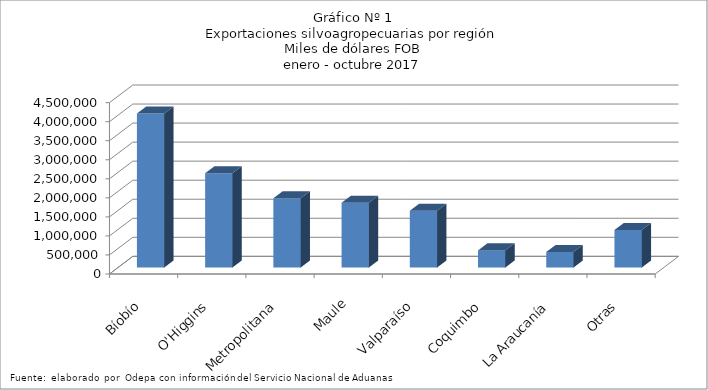
| Category | Series 0 |
|---|---|
| Bíobío | 4043255.953 |
| O'Higgins | 2475510.904 |
| Metropolitana | 1818499.797 |
| Maule | 1699561.113 |
| Valparaíso | 1492713.511 |
| Coquimbo | 450067.321 |
| La Araucanía | 408508.07 |
| Otras | 985084.042 |